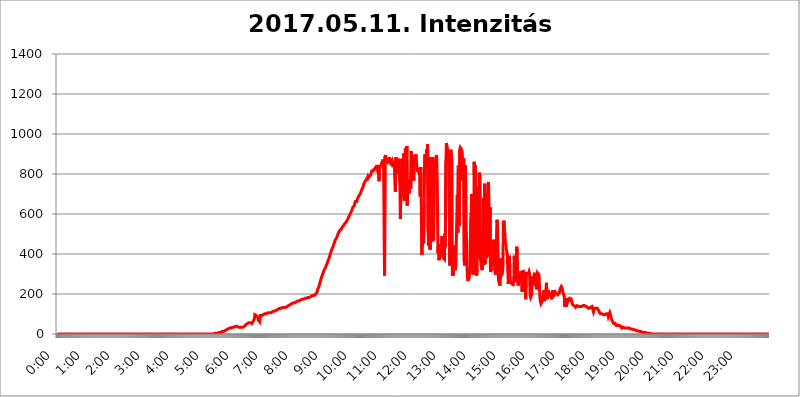
| Category | 2017.05.11. Intenzitás [W/m^2] |
|---|---|
| 0.0 | 0 |
| 0.0006944444444444445 | 0 |
| 0.001388888888888889 | 0 |
| 0.0020833333333333333 | 0 |
| 0.002777777777777778 | 0 |
| 0.003472222222222222 | 0 |
| 0.004166666666666667 | 0 |
| 0.004861111111111111 | 0 |
| 0.005555555555555556 | 0 |
| 0.0062499999999999995 | 0 |
| 0.006944444444444444 | 0 |
| 0.007638888888888889 | 0 |
| 0.008333333333333333 | 0 |
| 0.009027777777777779 | 0 |
| 0.009722222222222222 | 0 |
| 0.010416666666666666 | 0 |
| 0.011111111111111112 | 0 |
| 0.011805555555555555 | 0 |
| 0.012499999999999999 | 0 |
| 0.013194444444444444 | 0 |
| 0.013888888888888888 | 0 |
| 0.014583333333333332 | 0 |
| 0.015277777777777777 | 0 |
| 0.015972222222222224 | 0 |
| 0.016666666666666666 | 0 |
| 0.017361111111111112 | 0 |
| 0.018055555555555557 | 0 |
| 0.01875 | 0 |
| 0.019444444444444445 | 0 |
| 0.02013888888888889 | 0 |
| 0.020833333333333332 | 0 |
| 0.02152777777777778 | 0 |
| 0.022222222222222223 | 0 |
| 0.02291666666666667 | 0 |
| 0.02361111111111111 | 0 |
| 0.024305555555555556 | 0 |
| 0.024999999999999998 | 0 |
| 0.025694444444444447 | 0 |
| 0.02638888888888889 | 0 |
| 0.027083333333333334 | 0 |
| 0.027777777777777776 | 0 |
| 0.02847222222222222 | 0 |
| 0.029166666666666664 | 0 |
| 0.029861111111111113 | 0 |
| 0.030555555555555555 | 0 |
| 0.03125 | 0 |
| 0.03194444444444445 | 0 |
| 0.03263888888888889 | 0 |
| 0.03333333333333333 | 0 |
| 0.034027777777777775 | 0 |
| 0.034722222222222224 | 0 |
| 0.035416666666666666 | 0 |
| 0.036111111111111115 | 0 |
| 0.03680555555555556 | 0 |
| 0.0375 | 0 |
| 0.03819444444444444 | 0 |
| 0.03888888888888889 | 0 |
| 0.03958333333333333 | 0 |
| 0.04027777777777778 | 0 |
| 0.04097222222222222 | 0 |
| 0.041666666666666664 | 0 |
| 0.042361111111111106 | 0 |
| 0.04305555555555556 | 0 |
| 0.043750000000000004 | 0 |
| 0.044444444444444446 | 0 |
| 0.04513888888888889 | 0 |
| 0.04583333333333334 | 0 |
| 0.04652777777777778 | 0 |
| 0.04722222222222222 | 0 |
| 0.04791666666666666 | 0 |
| 0.04861111111111111 | 0 |
| 0.049305555555555554 | 0 |
| 0.049999999999999996 | 0 |
| 0.05069444444444445 | 0 |
| 0.051388888888888894 | 0 |
| 0.052083333333333336 | 0 |
| 0.05277777777777778 | 0 |
| 0.05347222222222222 | 0 |
| 0.05416666666666667 | 0 |
| 0.05486111111111111 | 0 |
| 0.05555555555555555 | 0 |
| 0.05625 | 0 |
| 0.05694444444444444 | 0 |
| 0.057638888888888885 | 0 |
| 0.05833333333333333 | 0 |
| 0.05902777777777778 | 0 |
| 0.059722222222222225 | 0 |
| 0.06041666666666667 | 0 |
| 0.061111111111111116 | 0 |
| 0.06180555555555556 | 0 |
| 0.0625 | 0 |
| 0.06319444444444444 | 0 |
| 0.06388888888888888 | 0 |
| 0.06458333333333334 | 0 |
| 0.06527777777777778 | 0 |
| 0.06597222222222222 | 0 |
| 0.06666666666666667 | 0 |
| 0.06736111111111111 | 0 |
| 0.06805555555555555 | 0 |
| 0.06874999999999999 | 0 |
| 0.06944444444444443 | 0 |
| 0.07013888888888889 | 0 |
| 0.07083333333333333 | 0 |
| 0.07152777777777779 | 0 |
| 0.07222222222222223 | 0 |
| 0.07291666666666667 | 0 |
| 0.07361111111111111 | 0 |
| 0.07430555555555556 | 0 |
| 0.075 | 0 |
| 0.07569444444444444 | 0 |
| 0.0763888888888889 | 0 |
| 0.07708333333333334 | 0 |
| 0.07777777777777778 | 0 |
| 0.07847222222222222 | 0 |
| 0.07916666666666666 | 0 |
| 0.0798611111111111 | 0 |
| 0.08055555555555556 | 0 |
| 0.08125 | 0 |
| 0.08194444444444444 | 0 |
| 0.08263888888888889 | 0 |
| 0.08333333333333333 | 0 |
| 0.08402777777777777 | 0 |
| 0.08472222222222221 | 0 |
| 0.08541666666666665 | 0 |
| 0.08611111111111112 | 0 |
| 0.08680555555555557 | 0 |
| 0.08750000000000001 | 0 |
| 0.08819444444444445 | 0 |
| 0.08888888888888889 | 0 |
| 0.08958333333333333 | 0 |
| 0.09027777777777778 | 0 |
| 0.09097222222222222 | 0 |
| 0.09166666666666667 | 0 |
| 0.09236111111111112 | 0 |
| 0.09305555555555556 | 0 |
| 0.09375 | 0 |
| 0.09444444444444444 | 0 |
| 0.09513888888888888 | 0 |
| 0.09583333333333333 | 0 |
| 0.09652777777777777 | 0 |
| 0.09722222222222222 | 0 |
| 0.09791666666666667 | 0 |
| 0.09861111111111111 | 0 |
| 0.09930555555555555 | 0 |
| 0.09999999999999999 | 0 |
| 0.10069444444444443 | 0 |
| 0.1013888888888889 | 0 |
| 0.10208333333333335 | 0 |
| 0.10277777777777779 | 0 |
| 0.10347222222222223 | 0 |
| 0.10416666666666667 | 0 |
| 0.10486111111111111 | 0 |
| 0.10555555555555556 | 0 |
| 0.10625 | 0 |
| 0.10694444444444444 | 0 |
| 0.1076388888888889 | 0 |
| 0.10833333333333334 | 0 |
| 0.10902777777777778 | 0 |
| 0.10972222222222222 | 0 |
| 0.1111111111111111 | 0 |
| 0.11180555555555556 | 0 |
| 0.11180555555555556 | 0 |
| 0.1125 | 0 |
| 0.11319444444444444 | 0 |
| 0.11388888888888889 | 0 |
| 0.11458333333333333 | 0 |
| 0.11527777777777777 | 0 |
| 0.11597222222222221 | 0 |
| 0.11666666666666665 | 0 |
| 0.1173611111111111 | 0 |
| 0.11805555555555557 | 0 |
| 0.11944444444444445 | 0 |
| 0.12013888888888889 | 0 |
| 0.12083333333333333 | 0 |
| 0.12152777777777778 | 0 |
| 0.12222222222222223 | 0 |
| 0.12291666666666667 | 0 |
| 0.12291666666666667 | 0 |
| 0.12361111111111112 | 0 |
| 0.12430555555555556 | 0 |
| 0.125 | 0 |
| 0.12569444444444444 | 0 |
| 0.12638888888888888 | 0 |
| 0.12708333333333333 | 0 |
| 0.16875 | 0 |
| 0.12847222222222224 | 0 |
| 0.12916666666666668 | 0 |
| 0.12986111111111112 | 0 |
| 0.13055555555555556 | 0 |
| 0.13125 | 0 |
| 0.13194444444444445 | 0 |
| 0.1326388888888889 | 0 |
| 0.13333333333333333 | 0 |
| 0.13402777777777777 | 0 |
| 0.13402777777777777 | 0 |
| 0.13472222222222222 | 0 |
| 0.13541666666666666 | 0 |
| 0.1361111111111111 | 0 |
| 0.13749999999999998 | 0 |
| 0.13819444444444443 | 0 |
| 0.1388888888888889 | 0 |
| 0.13958333333333334 | 0 |
| 0.14027777777777778 | 0 |
| 0.14097222222222222 | 0 |
| 0.14166666666666666 | 0 |
| 0.1423611111111111 | 0 |
| 0.14305555555555557 | 0 |
| 0.14375000000000002 | 0 |
| 0.14444444444444446 | 0 |
| 0.1451388888888889 | 0 |
| 0.1451388888888889 | 0 |
| 0.14652777777777778 | 0 |
| 0.14722222222222223 | 0 |
| 0.14791666666666667 | 0 |
| 0.1486111111111111 | 0 |
| 0.14930555555555555 | 0 |
| 0.15 | 0 |
| 0.15069444444444444 | 0 |
| 0.15138888888888888 | 0 |
| 0.15208333333333332 | 0 |
| 0.15277777777777776 | 0 |
| 0.15347222222222223 | 0 |
| 0.15416666666666667 | 0 |
| 0.15486111111111112 | 0 |
| 0.15555555555555556 | 0 |
| 0.15625 | 0 |
| 0.15694444444444444 | 0 |
| 0.15763888888888888 | 0 |
| 0.15833333333333333 | 0 |
| 0.15902777777777777 | 0 |
| 0.15972222222222224 | 0 |
| 0.16041666666666668 | 0 |
| 0.16111111111111112 | 0 |
| 0.16180555555555556 | 0 |
| 0.1625 | 0 |
| 0.16319444444444445 | 0 |
| 0.1638888888888889 | 0 |
| 0.16458333333333333 | 0 |
| 0.16527777777777777 | 0 |
| 0.16597222222222222 | 0 |
| 0.16666666666666666 | 0 |
| 0.1673611111111111 | 0 |
| 0.16805555555555554 | 0 |
| 0.16874999999999998 | 0 |
| 0.16944444444444443 | 0 |
| 0.17013888888888887 | 0 |
| 0.1708333333333333 | 0 |
| 0.17152777777777775 | 0 |
| 0.17222222222222225 | 0 |
| 0.1729166666666667 | 0 |
| 0.17361111111111113 | 0 |
| 0.17430555555555557 | 0 |
| 0.17500000000000002 | 0 |
| 0.17569444444444446 | 0 |
| 0.1763888888888889 | 0 |
| 0.17708333333333334 | 0 |
| 0.17777777777777778 | 0 |
| 0.17847222222222223 | 0 |
| 0.17916666666666667 | 0 |
| 0.1798611111111111 | 0 |
| 0.18055555555555555 | 0 |
| 0.18125 | 0 |
| 0.18194444444444444 | 0 |
| 0.1826388888888889 | 0 |
| 0.18333333333333335 | 0 |
| 0.1840277777777778 | 0 |
| 0.18472222222222223 | 0 |
| 0.18541666666666667 | 0 |
| 0.18611111111111112 | 0 |
| 0.18680555555555556 | 0 |
| 0.1875 | 0 |
| 0.18819444444444444 | 0 |
| 0.18888888888888888 | 0 |
| 0.18958333333333333 | 0 |
| 0.19027777777777777 | 0 |
| 0.1909722222222222 | 0 |
| 0.19166666666666665 | 0 |
| 0.19236111111111112 | 0 |
| 0.19305555555555554 | 0 |
| 0.19375 | 0 |
| 0.19444444444444445 | 0 |
| 0.1951388888888889 | 0 |
| 0.19583333333333333 | 0 |
| 0.19652777777777777 | 0 |
| 0.19722222222222222 | 0 |
| 0.19791666666666666 | 0 |
| 0.1986111111111111 | 0 |
| 0.19930555555555554 | 0 |
| 0.19999999999999998 | 0 |
| 0.20069444444444443 | 0 |
| 0.20138888888888887 | 0 |
| 0.2020833333333333 | 0 |
| 0.2027777777777778 | 0 |
| 0.2034722222222222 | 0 |
| 0.2041666666666667 | 0 |
| 0.20486111111111113 | 0 |
| 0.20555555555555557 | 0 |
| 0.20625000000000002 | 0 |
| 0.20694444444444446 | 0 |
| 0.2076388888888889 | 0 |
| 0.20833333333333334 | 0 |
| 0.20902777777777778 | 0 |
| 0.20972222222222223 | 0 |
| 0.21041666666666667 | 0 |
| 0.2111111111111111 | 0 |
| 0.21180555555555555 | 0 |
| 0.2125 | 0 |
| 0.21319444444444444 | 0 |
| 0.2138888888888889 | 0 |
| 0.21458333333333335 | 0 |
| 0.2152777777777778 | 0 |
| 0.21597222222222223 | 0 |
| 0.21666666666666667 | 0 |
| 0.21736111111111112 | 0 |
| 0.21805555555555556 | 0 |
| 0.21875 | 0 |
| 0.21944444444444444 | 0 |
| 0.22013888888888888 | 3.525 |
| 0.22083333333333333 | 3.525 |
| 0.22152777777777777 | 3.525 |
| 0.2222222222222222 | 3.525 |
| 0.22291666666666665 | 3.525 |
| 0.2236111111111111 | 3.525 |
| 0.22430555555555556 | 3.525 |
| 0.225 | 3.525 |
| 0.22569444444444445 | 3.525 |
| 0.2263888888888889 | 7.887 |
| 0.22708333333333333 | 7.887 |
| 0.22777777777777777 | 7.887 |
| 0.22847222222222222 | 7.887 |
| 0.22916666666666666 | 7.887 |
| 0.2298611111111111 | 7.887 |
| 0.23055555555555554 | 7.887 |
| 0.23124999999999998 | 12.257 |
| 0.23194444444444443 | 12.257 |
| 0.23263888888888887 | 12.257 |
| 0.2333333333333333 | 12.257 |
| 0.2340277777777778 | 16.636 |
| 0.2347222222222222 | 16.636 |
| 0.2354166666666667 | 16.636 |
| 0.23611111111111113 | 16.636 |
| 0.23680555555555557 | 21.024 |
| 0.23750000000000002 | 21.024 |
| 0.23819444444444446 | 21.024 |
| 0.2388888888888889 | 25.419 |
| 0.23958333333333334 | 25.419 |
| 0.24027777777777778 | 25.419 |
| 0.24097222222222223 | 29.823 |
| 0.24166666666666667 | 29.823 |
| 0.2423611111111111 | 29.823 |
| 0.24305555555555555 | 29.823 |
| 0.24375 | 29.823 |
| 0.24444444444444446 | 34.234 |
| 0.24513888888888888 | 34.234 |
| 0.24583333333333335 | 34.234 |
| 0.2465277777777778 | 34.234 |
| 0.24722222222222223 | 34.234 |
| 0.24791666666666667 | 34.234 |
| 0.24861111111111112 | 34.234 |
| 0.24930555555555556 | 34.234 |
| 0.25 | 38.653 |
| 0.25069444444444444 | 38.653 |
| 0.2513888888888889 | 38.653 |
| 0.2520833333333333 | 38.653 |
| 0.25277777777777777 | 38.653 |
| 0.2534722222222222 | 38.653 |
| 0.25416666666666665 | 34.234 |
| 0.2548611111111111 | 34.234 |
| 0.2555555555555556 | 34.234 |
| 0.25625000000000003 | 34.234 |
| 0.2569444444444445 | 34.234 |
| 0.2576388888888889 | 34.234 |
| 0.25833333333333336 | 34.234 |
| 0.2590277777777778 | 34.234 |
| 0.25972222222222224 | 34.234 |
| 0.2604166666666667 | 34.234 |
| 0.2611111111111111 | 38.653 |
| 0.26180555555555557 | 38.653 |
| 0.2625 | 38.653 |
| 0.26319444444444445 | 43.079 |
| 0.2638888888888889 | 43.079 |
| 0.26458333333333334 | 47.511 |
| 0.2652777777777778 | 47.511 |
| 0.2659722222222222 | 51.951 |
| 0.26666666666666666 | 51.951 |
| 0.2673611111111111 | 51.951 |
| 0.26805555555555555 | 56.398 |
| 0.26875 | 56.398 |
| 0.26944444444444443 | 56.398 |
| 0.2701388888888889 | 56.398 |
| 0.2708333333333333 | 56.398 |
| 0.27152777777777776 | 56.398 |
| 0.2722222222222222 | 51.951 |
| 0.27291666666666664 | 51.951 |
| 0.2736111111111111 | 56.398 |
| 0.2743055555555555 | 60.85 |
| 0.27499999999999997 | 60.85 |
| 0.27569444444444446 | 65.31 |
| 0.27638888888888885 | 74.246 |
| 0.27708333333333335 | 96.682 |
| 0.2777777777777778 | 96.682 |
| 0.27847222222222223 | 101.184 |
| 0.2791666666666667 | 92.184 |
| 0.2798611111111111 | 96.682 |
| 0.28055555555555556 | 92.184 |
| 0.28125 | 83.205 |
| 0.28194444444444444 | 69.775 |
| 0.2826388888888889 | 65.31 |
| 0.2833333333333333 | 65.31 |
| 0.28402777777777777 | 60.85 |
| 0.2847222222222222 | 92.184 |
| 0.28541666666666665 | 92.184 |
| 0.28611111111111115 | 92.184 |
| 0.28680555555555554 | 92.184 |
| 0.28750000000000003 | 96.682 |
| 0.2881944444444445 | 96.682 |
| 0.2888888888888889 | 96.682 |
| 0.28958333333333336 | 96.682 |
| 0.2902777777777778 | 96.682 |
| 0.29097222222222224 | 101.184 |
| 0.2916666666666667 | 101.184 |
| 0.2923611111111111 | 101.184 |
| 0.29305555555555557 | 101.184 |
| 0.29375 | 101.184 |
| 0.29444444444444445 | 101.184 |
| 0.2951388888888889 | 105.69 |
| 0.29583333333333334 | 105.69 |
| 0.2965277777777778 | 105.69 |
| 0.2972222222222222 | 105.69 |
| 0.29791666666666666 | 105.69 |
| 0.2986111111111111 | 105.69 |
| 0.29930555555555555 | 105.69 |
| 0.3 | 105.69 |
| 0.30069444444444443 | 110.201 |
| 0.3013888888888889 | 110.201 |
| 0.3020833333333333 | 110.201 |
| 0.30277777777777776 | 110.201 |
| 0.3034722222222222 | 114.716 |
| 0.30416666666666664 | 114.716 |
| 0.3048611111111111 | 114.716 |
| 0.3055555555555555 | 114.716 |
| 0.30624999999999997 | 119.235 |
| 0.3069444444444444 | 119.235 |
| 0.3076388888888889 | 119.235 |
| 0.30833333333333335 | 119.235 |
| 0.3090277777777778 | 119.235 |
| 0.30972222222222223 | 123.758 |
| 0.3104166666666667 | 123.758 |
| 0.3111111111111111 | 123.758 |
| 0.31180555555555556 | 128.284 |
| 0.3125 | 128.284 |
| 0.31319444444444444 | 128.284 |
| 0.3138888888888889 | 128.284 |
| 0.3145833333333333 | 128.284 |
| 0.31527777777777777 | 128.284 |
| 0.3159722222222222 | 132.814 |
| 0.31666666666666665 | 132.814 |
| 0.31736111111111115 | 132.814 |
| 0.31805555555555554 | 132.814 |
| 0.31875000000000003 | 132.814 |
| 0.3194444444444445 | 137.347 |
| 0.3201388888888889 | 132.814 |
| 0.32083333333333336 | 137.347 |
| 0.3215277777777778 | 137.347 |
| 0.32222222222222224 | 137.347 |
| 0.3229166666666667 | 141.884 |
| 0.3236111111111111 | 141.884 |
| 0.32430555555555557 | 141.884 |
| 0.325 | 146.423 |
| 0.32569444444444445 | 146.423 |
| 0.3263888888888889 | 146.423 |
| 0.32708333333333334 | 146.423 |
| 0.3277777777777778 | 146.423 |
| 0.3284722222222222 | 150.964 |
| 0.32916666666666666 | 150.964 |
| 0.3298611111111111 | 150.964 |
| 0.33055555555555555 | 155.509 |
| 0.33125 | 155.509 |
| 0.33194444444444443 | 155.509 |
| 0.3326388888888889 | 155.509 |
| 0.3333333333333333 | 155.509 |
| 0.3340277777777778 | 160.056 |
| 0.3347222222222222 | 160.056 |
| 0.3354166666666667 | 160.056 |
| 0.3361111111111111 | 160.056 |
| 0.3368055555555556 | 164.605 |
| 0.33749999999999997 | 164.605 |
| 0.33819444444444446 | 164.605 |
| 0.33888888888888885 | 164.605 |
| 0.33958333333333335 | 169.156 |
| 0.34027777777777773 | 169.156 |
| 0.34097222222222223 | 169.156 |
| 0.3416666666666666 | 169.156 |
| 0.3423611111111111 | 173.709 |
| 0.3430555555555555 | 173.709 |
| 0.34375 | 173.709 |
| 0.3444444444444445 | 173.709 |
| 0.3451388888888889 | 173.709 |
| 0.3458333333333334 | 173.709 |
| 0.34652777777777777 | 173.709 |
| 0.34722222222222227 | 178.264 |
| 0.34791666666666665 | 178.264 |
| 0.34861111111111115 | 178.264 |
| 0.34930555555555554 | 178.264 |
| 0.35000000000000003 | 178.264 |
| 0.3506944444444444 | 182.82 |
| 0.3513888888888889 | 182.82 |
| 0.3520833333333333 | 182.82 |
| 0.3527777777777778 | 182.82 |
| 0.3534722222222222 | 182.82 |
| 0.3541666666666667 | 187.378 |
| 0.3548611111111111 | 187.378 |
| 0.35555555555555557 | 187.378 |
| 0.35625 | 187.378 |
| 0.35694444444444445 | 187.378 |
| 0.3576388888888889 | 191.937 |
| 0.35833333333333334 | 191.937 |
| 0.3590277777777778 | 191.937 |
| 0.3597222222222222 | 191.937 |
| 0.36041666666666666 | 191.937 |
| 0.3611111111111111 | 196.497 |
| 0.36180555555555555 | 196.497 |
| 0.3625 | 201.058 |
| 0.36319444444444443 | 201.058 |
| 0.3638888888888889 | 205.62 |
| 0.3645833333333333 | 214.746 |
| 0.3652777777777778 | 223.873 |
| 0.3659722222222222 | 228.436 |
| 0.3666666666666667 | 233 |
| 0.3673611111111111 | 242.127 |
| 0.3680555555555556 | 251.251 |
| 0.36874999999999997 | 260.373 |
| 0.36944444444444446 | 269.49 |
| 0.37013888888888885 | 278.603 |
| 0.37083333333333335 | 283.156 |
| 0.37152777777777773 | 292.259 |
| 0.37222222222222223 | 296.808 |
| 0.3729166666666666 | 305.898 |
| 0.3736111111111111 | 310.44 |
| 0.3743055555555555 | 319.517 |
| 0.375 | 324.052 |
| 0.3756944444444445 | 324.052 |
| 0.3763888888888889 | 333.113 |
| 0.3770833333333334 | 342.162 |
| 0.37777777777777777 | 346.682 |
| 0.37847222222222227 | 351.198 |
| 0.37916666666666665 | 360.221 |
| 0.37986111111111115 | 364.728 |
| 0.38055555555555554 | 373.729 |
| 0.38125000000000003 | 378.224 |
| 0.3819444444444444 | 387.202 |
| 0.3826388888888889 | 396.164 |
| 0.3833333333333333 | 405.108 |
| 0.3840277777777778 | 409.574 |
| 0.3847222222222222 | 418.492 |
| 0.3854166666666667 | 422.943 |
| 0.3861111111111111 | 431.833 |
| 0.38680555555555557 | 436.27 |
| 0.3875 | 445.129 |
| 0.38819444444444445 | 445.129 |
| 0.3888888888888889 | 458.38 |
| 0.38958333333333334 | 467.187 |
| 0.3902777777777778 | 471.582 |
| 0.3909722222222222 | 475.972 |
| 0.39166666666666666 | 480.356 |
| 0.3923611111111111 | 484.735 |
| 0.39305555555555555 | 493.475 |
| 0.39375 | 497.836 |
| 0.39444444444444443 | 506.542 |
| 0.3951388888888889 | 506.542 |
| 0.3958333333333333 | 506.542 |
| 0.3965277777777778 | 519.555 |
| 0.3972222222222222 | 523.88 |
| 0.3979166666666667 | 523.88 |
| 0.3986111111111111 | 523.88 |
| 0.3993055555555556 | 532.513 |
| 0.39999999999999997 | 536.82 |
| 0.40069444444444446 | 536.82 |
| 0.40138888888888885 | 541.121 |
| 0.40208333333333335 | 541.121 |
| 0.40277777777777773 | 549.704 |
| 0.40347222222222223 | 549.704 |
| 0.4041666666666666 | 549.704 |
| 0.4048611111111111 | 558.261 |
| 0.4055555555555555 | 558.261 |
| 0.40625 | 566.793 |
| 0.4069444444444445 | 566.793 |
| 0.4076388888888889 | 575.299 |
| 0.4083333333333334 | 579.542 |
| 0.40902777777777777 | 588.009 |
| 0.40972222222222227 | 592.233 |
| 0.41041666666666665 | 596.45 |
| 0.41111111111111115 | 600.661 |
| 0.41180555555555554 | 609.062 |
| 0.41250000000000003 | 613.252 |
| 0.4131944444444444 | 617.436 |
| 0.4138888888888889 | 625.784 |
| 0.4145833333333333 | 634.105 |
| 0.4152777777777778 | 638.256 |
| 0.4159722222222222 | 638.256 |
| 0.4166666666666667 | 642.4 |
| 0.4173611111111111 | 654.791 |
| 0.41805555555555557 | 663.019 |
| 0.41875 | 658.909 |
| 0.41944444444444445 | 663.019 |
| 0.4201388888888889 | 663.019 |
| 0.42083333333333334 | 675.311 |
| 0.4215277777777778 | 679.395 |
| 0.4222222222222222 | 683.473 |
| 0.42291666666666666 | 691.608 |
| 0.4236111111111111 | 691.608 |
| 0.42430555555555555 | 691.608 |
| 0.425 | 699.717 |
| 0.42569444444444443 | 707.8 |
| 0.4263888888888889 | 715.858 |
| 0.4270833333333333 | 719.877 |
| 0.4277777777777778 | 719.877 |
| 0.4284722222222222 | 731.896 |
| 0.4291666666666667 | 739.877 |
| 0.4298611111111111 | 747.834 |
| 0.4305555555555556 | 755.766 |
| 0.43124999999999997 | 755.766 |
| 0.43194444444444446 | 763.674 |
| 0.43263888888888885 | 759.723 |
| 0.43333333333333335 | 763.674 |
| 0.43402777777777773 | 775.492 |
| 0.43472222222222223 | 779.42 |
| 0.4354166666666666 | 787.258 |
| 0.4361111111111111 | 779.42 |
| 0.4368055555555555 | 779.42 |
| 0.4375 | 787.258 |
| 0.4381944444444445 | 787.258 |
| 0.4388888888888889 | 791.169 |
| 0.4395833333333334 | 795.074 |
| 0.44027777777777777 | 806.757 |
| 0.44097222222222227 | 814.519 |
| 0.44166666666666665 | 814.519 |
| 0.44236111111111115 | 814.519 |
| 0.44305555555555554 | 814.519 |
| 0.44375000000000003 | 822.26 |
| 0.4444444444444444 | 826.123 |
| 0.4451388888888889 | 822.26 |
| 0.4458333333333333 | 826.123 |
| 0.4465277777777778 | 837.682 |
| 0.4472222222222222 | 829.981 |
| 0.4479166666666667 | 826.123 |
| 0.4486111111111111 | 845.365 |
| 0.44930555555555557 | 845.365 |
| 0.45 | 849.199 |
| 0.45069444444444445 | 798.974 |
| 0.4513888888888889 | 763.674 |
| 0.45208333333333334 | 841.526 |
| 0.4527777777777778 | 833.834 |
| 0.4534722222222222 | 833.834 |
| 0.45416666666666666 | 837.682 |
| 0.4548611111111111 | 853.029 |
| 0.45555555555555555 | 845.365 |
| 0.45625 | 860.676 |
| 0.45694444444444443 | 872.114 |
| 0.4576388888888889 | 845.365 |
| 0.4583333333333333 | 845.365 |
| 0.4590277777777778 | 292.259 |
| 0.4597222222222222 | 887.309 |
| 0.4604166666666667 | 894.885 |
| 0.4611111111111111 | 875.918 |
| 0.4618055555555556 | 875.918 |
| 0.46249999999999997 | 875.918 |
| 0.46319444444444446 | 868.305 |
| 0.46388888888888885 | 860.676 |
| 0.46458333333333335 | 864.493 |
| 0.46527777777777773 | 868.305 |
| 0.46597222222222223 | 883.516 |
| 0.4666666666666666 | 868.305 |
| 0.4673611111111111 | 856.855 |
| 0.4680555555555555 | 860.676 |
| 0.46875 | 860.676 |
| 0.4694444444444445 | 868.305 |
| 0.4701388888888889 | 868.305 |
| 0.4708333333333334 | 833.834 |
| 0.47152777777777777 | 845.365 |
| 0.47222222222222227 | 841.526 |
| 0.47291666666666665 | 864.493 |
| 0.47361111111111115 | 868.305 |
| 0.47430555555555554 | 711.832 |
| 0.47500000000000003 | 883.516 |
| 0.4756944444444444 | 860.676 |
| 0.4763888888888889 | 829.981 |
| 0.4770833333333333 | 845.365 |
| 0.4777777777777778 | 810.641 |
| 0.4784722222222222 | 875.918 |
| 0.4791666666666667 | 798.974 |
| 0.4798611111111111 | 826.123 |
| 0.48055555555555557 | 755.766 |
| 0.48125 | 575.299 |
| 0.48194444444444445 | 719.877 |
| 0.4826388888888889 | 814.519 |
| 0.48333333333333334 | 875.918 |
| 0.4840277777777778 | 687.544 |
| 0.4847222222222222 | 826.123 |
| 0.48541666666666666 | 775.492 |
| 0.4861111111111111 | 902.447 |
| 0.48680555555555555 | 667.123 |
| 0.4875 | 755.766 |
| 0.48819444444444443 | 928.819 |
| 0.4888888888888889 | 932.576 |
| 0.4895833333333333 | 879.719 |
| 0.4902777777777778 | 940.082 |
| 0.4909722222222222 | 642.4 |
| 0.4916666666666667 | 739.877 |
| 0.4923611111111111 | 703.762 |
| 0.4930555555555556 | 739.877 |
| 0.49374999999999997 | 703.762 |
| 0.49444444444444446 | 771.559 |
| 0.49513888888888885 | 767.62 |
| 0.49583333333333335 | 727.896 |
| 0.49652777777777773 | 913.766 |
| 0.49722222222222223 | 887.309 |
| 0.4979166666666666 | 853.029 |
| 0.4986111111111111 | 798.974 |
| 0.4993055555555555 | 837.682 |
| 0.5 | 767.62 |
| 0.5006944444444444 | 887.309 |
| 0.5013888888888889 | 894.885 |
| 0.5020833333333333 | 868.305 |
| 0.5027777777777778 | 898.668 |
| 0.5034722222222222 | 875.918 |
| 0.5041666666666667 | 845.365 |
| 0.5048611111111111 | 822.26 |
| 0.5055555555555555 | 810.641 |
| 0.50625 | 829.981 |
| 0.5069444444444444 | 810.641 |
| 0.5076388888888889 | 802.868 |
| 0.5083333333333333 | 791.169 |
| 0.5090277777777777 | 687.544 |
| 0.5097222222222222 | 833.834 |
| 0.5104166666666666 | 759.723 |
| 0.5111111111111112 | 396.164 |
| 0.5118055555555555 | 405.108 |
| 0.5125000000000001 | 480.356 |
| 0.5131944444444444 | 510.885 |
| 0.513888888888889 | 453.968 |
| 0.5145833333333333 | 650.667 |
| 0.5152777777777778 | 883.516 |
| 0.5159722222222222 | 898.668 |
| 0.5166666666666667 | 902.447 |
| 0.517361111111111 | 837.682 |
| 0.5180555555555556 | 925.06 |
| 0.5187499999999999 | 902.447 |
| 0.5194444444444445 | 947.58 |
| 0.5201388888888888 | 515.223 |
| 0.5208333333333334 | 440.702 |
| 0.5215277777777778 | 493.475 |
| 0.5222222222222223 | 883.516 |
| 0.5229166666666667 | 422.943 |
| 0.5236111111111111 | 806.757 |
| 0.5243055555555556 | 829.981 |
| 0.525 | 600.661 |
| 0.5256944444444445 | 462.786 |
| 0.5263888888888889 | 883.516 |
| 0.5270833333333333 | 872.114 |
| 0.5277777777777778 | 467.187 |
| 0.5284722222222222 | 841.526 |
| 0.5291666666666667 | 791.169 |
| 0.5298611111111111 | 837.682 |
| 0.5305555555555556 | 860.676 |
| 0.53125 | 887.309 |
| 0.5319444444444444 | 894.885 |
| 0.5326388888888889 | 891.099 |
| 0.5333333333333333 | 604.864 |
| 0.5340277777777778 | 405.108 |
| 0.5347222222222222 | 449.551 |
| 0.5354166666666667 | 369.23 |
| 0.5361111111111111 | 373.729 |
| 0.5368055555555555 | 396.164 |
| 0.5375 | 400.638 |
| 0.5381944444444444 | 405.108 |
| 0.5388888888888889 | 396.164 |
| 0.5395833333333333 | 489.108 |
| 0.5402777777777777 | 458.38 |
| 0.5409722222222222 | 382.715 |
| 0.5416666666666666 | 378.224 |
| 0.5423611111111112 | 387.202 |
| 0.5430555555555555 | 373.729 |
| 0.5437500000000001 | 502.192 |
| 0.5444444444444444 | 436.27 |
| 0.545138888888889 | 864.493 |
| 0.5458333333333333 | 955.071 |
| 0.5465277777777778 | 936.33 |
| 0.5472222222222222 | 928.819 |
| 0.5479166666666667 | 921.298 |
| 0.548611111111111 | 856.855 |
| 0.5493055555555556 | 909.996 |
| 0.5499999999999999 | 906.223 |
| 0.5506944444444445 | 342.162 |
| 0.5513888888888888 | 711.832 |
| 0.5520833333333334 | 921.298 |
| 0.5527777777777778 | 887.309 |
| 0.5534722222222223 | 875.918 |
| 0.5541666666666667 | 292.259 |
| 0.5548611111111111 | 310.44 |
| 0.5555555555555556 | 292.259 |
| 0.55625 | 337.639 |
| 0.5569444444444445 | 445.129 |
| 0.5576388888888889 | 333.113 |
| 0.5583333333333333 | 319.517 |
| 0.5590277777777778 | 351.198 |
| 0.5597222222222222 | 355.712 |
| 0.5604166666666667 | 346.682 |
| 0.5611111111111111 | 695.666 |
| 0.5618055555555556 | 506.542 |
| 0.5625 | 841.526 |
| 0.5631944444444444 | 818.392 |
| 0.5638888888888889 | 541.121 |
| 0.5645833333333333 | 921.298 |
| 0.5652777777777778 | 932.576 |
| 0.5659722222222222 | 932.576 |
| 0.5666666666666667 | 925.06 |
| 0.5673611111111111 | 917.534 |
| 0.5680555555555555 | 909.996 |
| 0.56875 | 767.62 |
| 0.5694444444444444 | 872.114 |
| 0.5701388888888889 | 879.719 |
| 0.5708333333333333 | 364.728 |
| 0.5715277777777777 | 342.162 |
| 0.5722222222222222 | 845.365 |
| 0.5729166666666666 | 735.89 |
| 0.5736111111111112 | 506.542 |
| 0.5743055555555555 | 462.786 |
| 0.5750000000000001 | 310.44 |
| 0.5756944444444444 | 264.932 |
| 0.576388888888889 | 264.932 |
| 0.5770833333333333 | 269.49 |
| 0.5777777777777778 | 283.156 |
| 0.5784722222222222 | 314.98 |
| 0.5791666666666667 | 337.639 |
| 0.579861111111111 | 571.049 |
| 0.5805555555555556 | 609.062 |
| 0.5812499999999999 | 699.717 |
| 0.5819444444444445 | 396.164 |
| 0.5826388888888888 | 305.898 |
| 0.5833333333333334 | 296.808 |
| 0.5840277777777778 | 314.98 |
| 0.5847222222222223 | 860.676 |
| 0.5854166666666667 | 715.858 |
| 0.5861111111111111 | 845.365 |
| 0.5868055555555556 | 414.035 |
| 0.5875 | 301.354 |
| 0.5881944444444445 | 292.259 |
| 0.5888888888888889 | 324.052 |
| 0.5895833333333333 | 735.89 |
| 0.5902777777777778 | 378.224 |
| 0.5909722222222222 | 458.38 |
| 0.5916666666666667 | 806.757 |
| 0.5923611111111111 | 810.641 |
| 0.5930555555555556 | 787.258 |
| 0.59375 | 369.23 |
| 0.5944444444444444 | 342.162 |
| 0.5951388888888889 | 342.162 |
| 0.5958333333333333 | 319.517 |
| 0.5965277777777778 | 342.162 |
| 0.5972222222222222 | 373.729 |
| 0.5979166666666667 | 679.395 |
| 0.5986111111111111 | 346.682 |
| 0.5993055555555555 | 751.803 |
| 0.6 | 351.198 |
| 0.6006944444444444 | 703.762 |
| 0.6013888888888889 | 378.224 |
| 0.6020833333333333 | 396.164 |
| 0.6027777777777777 | 493.475 |
| 0.6034722222222222 | 387.202 |
| 0.6041666666666666 | 751.803 |
| 0.6048611111111112 | 759.723 |
| 0.6055555555555555 | 558.261 |
| 0.6062500000000001 | 497.836 |
| 0.6069444444444444 | 634.105 |
| 0.607638888888889 | 310.44 |
| 0.6083333333333333 | 305.898 |
| 0.6090277777777778 | 324.052 |
| 0.6097222222222222 | 342.162 |
| 0.6104166666666667 | 351.198 |
| 0.611111111111111 | 387.202 |
| 0.6118055555555556 | 471.582 |
| 0.6124999999999999 | 369.23 |
| 0.6131944444444445 | 355.712 |
| 0.6138888888888888 | 310.44 |
| 0.6145833333333334 | 296.808 |
| 0.6152777777777778 | 301.354 |
| 0.6159722222222223 | 467.187 |
| 0.6166666666666667 | 571.049 |
| 0.6173611111111111 | 553.986 |
| 0.6180555555555556 | 440.702 |
| 0.61875 | 274.047 |
| 0.6194444444444445 | 260.373 |
| 0.6201388888888889 | 251.251 |
| 0.6208333333333333 | 242.127 |
| 0.6215277777777778 | 246.689 |
| 0.6222222222222222 | 378.224 |
| 0.6229166666666667 | 292.259 |
| 0.6236111111111111 | 287.709 |
| 0.6243055555555556 | 301.354 |
| 0.625 | 333.113 |
| 0.6256944444444444 | 553.986 |
| 0.6263888888888889 | 566.793 |
| 0.6270833333333333 | 523.88 |
| 0.6277777777777778 | 502.192 |
| 0.6284722222222222 | 458.38 |
| 0.6291666666666667 | 445.129 |
| 0.6298611111111111 | 422.943 |
| 0.6305555555555555 | 422.943 |
| 0.63125 | 396.164 |
| 0.6319444444444444 | 314.98 |
| 0.6326388888888889 | 251.251 |
| 0.6333333333333333 | 255.813 |
| 0.6340277777777777 | 391.685 |
| 0.6347222222222222 | 328.584 |
| 0.6354166666666666 | 269.49 |
| 0.6361111111111112 | 260.373 |
| 0.6368055555555555 | 264.932 |
| 0.6375000000000001 | 251.251 |
| 0.6381944444444444 | 246.689 |
| 0.638888888888889 | 246.689 |
| 0.6395833333333333 | 246.689 |
| 0.6402777777777778 | 255.813 |
| 0.6409722222222222 | 391.685 |
| 0.6416666666666667 | 314.98 |
| 0.642361111111111 | 278.603 |
| 0.6430555555555556 | 269.49 |
| 0.6437499999999999 | 260.373 |
| 0.6444444444444445 | 436.27 |
| 0.6451388888888888 | 409.574 |
| 0.6458333333333334 | 255.813 |
| 0.6465277777777778 | 242.127 |
| 0.6472222222222223 | 246.689 |
| 0.6479166666666667 | 296.808 |
| 0.6486111111111111 | 314.98 |
| 0.6493055555555556 | 301.354 |
| 0.65 | 269.49 |
| 0.6506944444444445 | 314.98 |
| 0.6513888888888889 | 251.251 |
| 0.6520833333333333 | 210.182 |
| 0.6527777777777778 | 283.156 |
| 0.6534722222222222 | 319.517 |
| 0.6541666666666667 | 310.44 |
| 0.6548611111111111 | 305.898 |
| 0.6555555555555556 | 305.898 |
| 0.65625 | 255.813 |
| 0.6569444444444444 | 173.709 |
| 0.6576388888888889 | 292.259 |
| 0.6583333333333333 | 310.44 |
| 0.6590277777777778 | 301.354 |
| 0.6597222222222222 | 296.808 |
| 0.6604166666666667 | 296.808 |
| 0.6611111111111111 | 301.354 |
| 0.6618055555555555 | 310.44 |
| 0.6625 | 301.354 |
| 0.6631944444444444 | 191.937 |
| 0.6638888888888889 | 182.82 |
| 0.6645833333333333 | 182.82 |
| 0.6652777777777777 | 196.497 |
| 0.6659722222222222 | 233 |
| 0.6666666666666666 | 287.709 |
| 0.6673611111111111 | 246.689 |
| 0.6680555555555556 | 242.127 |
| 0.6687500000000001 | 246.689 |
| 0.6694444444444444 | 305.898 |
| 0.6701388888888888 | 260.373 |
| 0.6708333333333334 | 251.251 |
| 0.6715277777777778 | 260.373 |
| 0.6722222222222222 | 223.873 |
| 0.6729166666666666 | 274.047 |
| 0.6736111111111112 | 305.898 |
| 0.6743055555555556 | 310.44 |
| 0.6749999999999999 | 310.44 |
| 0.6756944444444444 | 296.808 |
| 0.6763888888888889 | 228.436 |
| 0.6770833333333334 | 173.709 |
| 0.6777777777777777 | 160.056 |
| 0.6784722222222223 | 150.964 |
| 0.6791666666666667 | 155.509 |
| 0.6798611111111111 | 160.056 |
| 0.6805555555555555 | 169.156 |
| 0.68125 | 169.156 |
| 0.6819444444444445 | 164.605 |
| 0.6826388888888889 | 219.309 |
| 0.6833333333333332 | 164.605 |
| 0.6840277777777778 | 173.709 |
| 0.6847222222222222 | 182.82 |
| 0.6854166666666667 | 187.378 |
| 0.686111111111111 | 255.813 |
| 0.6868055555555556 | 191.937 |
| 0.6875 | 173.709 |
| 0.6881944444444444 | 219.309 |
| 0.688888888888889 | 205.62 |
| 0.6895833333333333 | 201.058 |
| 0.6902777777777778 | 201.058 |
| 0.6909722222222222 | 201.058 |
| 0.6916666666666668 | 191.937 |
| 0.6923611111111111 | 191.937 |
| 0.6930555555555555 | 196.497 |
| 0.69375 | 173.709 |
| 0.6944444444444445 | 210.182 |
| 0.6951388888888889 | 219.309 |
| 0.6958333333333333 | 219.309 |
| 0.6965277777777777 | 187.378 |
| 0.6972222222222223 | 219.309 |
| 0.6979166666666666 | 210.182 |
| 0.6986111111111111 | 210.182 |
| 0.6993055555555556 | 210.182 |
| 0.7000000000000001 | 205.62 |
| 0.7006944444444444 | 205.62 |
| 0.7013888888888888 | 201.058 |
| 0.7020833333333334 | 196.497 |
| 0.7027777777777778 | 196.497 |
| 0.7034722222222222 | 201.058 |
| 0.7041666666666666 | 205.62 |
| 0.7048611111111112 | 219.309 |
| 0.7055555555555556 | 228.436 |
| 0.7062499999999999 | 233 |
| 0.7069444444444444 | 237.564 |
| 0.7076388888888889 | 237.564 |
| 0.7083333333333334 | 228.436 |
| 0.7090277777777777 | 210.182 |
| 0.7097222222222223 | 205.62 |
| 0.7104166666666667 | 196.497 |
| 0.7111111111111111 | 187.378 |
| 0.7118055555555555 | 137.347 |
| 0.7125 | 169.156 |
| 0.7131944444444445 | 178.264 |
| 0.7138888888888889 | 137.347 |
| 0.7145833333333332 | 132.814 |
| 0.7152777777777778 | 160.056 |
| 0.7159722222222222 | 173.709 |
| 0.7166666666666667 | 173.709 |
| 0.717361111111111 | 178.264 |
| 0.7180555555555556 | 178.264 |
| 0.71875 | 169.156 |
| 0.7194444444444444 | 169.156 |
| 0.720138888888889 | 169.156 |
| 0.7208333333333333 | 173.709 |
| 0.7215277777777778 | 164.605 |
| 0.7222222222222222 | 155.509 |
| 0.7229166666666668 | 146.423 |
| 0.7236111111111111 | 146.423 |
| 0.7243055555555555 | 146.423 |
| 0.725 | 141.884 |
| 0.7256944444444445 | 141.884 |
| 0.7263888888888889 | 137.347 |
| 0.7270833333333333 | 132.814 |
| 0.7277777777777777 | 132.814 |
| 0.7284722222222223 | 137.347 |
| 0.7291666666666666 | 141.884 |
| 0.7298611111111111 | 141.884 |
| 0.7305555555555556 | 141.884 |
| 0.7312500000000001 | 137.347 |
| 0.7319444444444444 | 137.347 |
| 0.7326388888888888 | 137.347 |
| 0.7333333333333334 | 137.347 |
| 0.7340277777777778 | 137.347 |
| 0.7347222222222222 | 137.347 |
| 0.7354166666666666 | 137.347 |
| 0.7361111111111112 | 137.347 |
| 0.7368055555555556 | 137.347 |
| 0.7374999999999999 | 141.884 |
| 0.7381944444444444 | 141.884 |
| 0.7388888888888889 | 141.884 |
| 0.7395833333333334 | 141.884 |
| 0.7402777777777777 | 137.347 |
| 0.7409722222222223 | 137.347 |
| 0.7416666666666667 | 137.347 |
| 0.7423611111111111 | 137.347 |
| 0.7430555555555555 | 137.347 |
| 0.74375 | 132.814 |
| 0.7444444444444445 | 128.284 |
| 0.7451388888888889 | 128.284 |
| 0.7458333333333332 | 128.284 |
| 0.7465277777777778 | 128.284 |
| 0.7472222222222222 | 132.814 |
| 0.7479166666666667 | 132.814 |
| 0.748611111111111 | 132.814 |
| 0.7493055555555556 | 132.814 |
| 0.75 | 137.347 |
| 0.7506944444444444 | 137.347 |
| 0.751388888888889 | 137.347 |
| 0.7520833333333333 | 110.201 |
| 0.7527777777777778 | 114.716 |
| 0.7534722222222222 | 128.284 |
| 0.7541666666666668 | 128.284 |
| 0.7548611111111111 | 123.758 |
| 0.7555555555555555 | 128.284 |
| 0.75625 | 128.284 |
| 0.7569444444444445 | 128.284 |
| 0.7576388888888889 | 128.284 |
| 0.7583333333333333 | 123.758 |
| 0.7590277777777777 | 119.235 |
| 0.7597222222222223 | 114.716 |
| 0.7604166666666666 | 110.201 |
| 0.7611111111111111 | 105.69 |
| 0.7618055555555556 | 101.184 |
| 0.7625000000000001 | 101.184 |
| 0.7631944444444444 | 101.184 |
| 0.7638888888888888 | 101.184 |
| 0.7645833333333334 | 96.682 |
| 0.7652777777777778 | 96.682 |
| 0.7659722222222222 | 96.682 |
| 0.7666666666666666 | 96.682 |
| 0.7673611111111112 | 96.682 |
| 0.7680555555555556 | 96.682 |
| 0.7687499999999999 | 96.682 |
| 0.7694444444444444 | 96.682 |
| 0.7701388888888889 | 101.184 |
| 0.7708333333333334 | 101.184 |
| 0.7715277777777777 | 101.184 |
| 0.7722222222222223 | 101.184 |
| 0.7729166666666667 | 87.692 |
| 0.7736111111111111 | 87.692 |
| 0.7743055555555555 | 101.184 |
| 0.775 | 87.692 |
| 0.7756944444444445 | 96.682 |
| 0.7763888888888889 | 87.692 |
| 0.7770833333333332 | 78.722 |
| 0.7777777777777778 | 69.775 |
| 0.7784722222222222 | 65.31 |
| 0.7791666666666667 | 60.85 |
| 0.779861111111111 | 56.398 |
| 0.7805555555555556 | 51.951 |
| 0.78125 | 47.511 |
| 0.7819444444444444 | 51.951 |
| 0.782638888888889 | 51.951 |
| 0.7833333333333333 | 47.511 |
| 0.7840277777777778 | 43.079 |
| 0.7847222222222222 | 43.079 |
| 0.7854166666666668 | 43.079 |
| 0.7861111111111111 | 43.079 |
| 0.7868055555555555 | 43.079 |
| 0.7875 | 43.079 |
| 0.7881944444444445 | 43.079 |
| 0.7888888888888889 | 43.079 |
| 0.7895833333333333 | 38.653 |
| 0.7902777777777777 | 38.653 |
| 0.7909722222222223 | 34.234 |
| 0.7916666666666666 | 29.823 |
| 0.7923611111111111 | 29.823 |
| 0.7930555555555556 | 29.823 |
| 0.7937500000000001 | 34.234 |
| 0.7944444444444444 | 29.823 |
| 0.7951388888888888 | 29.823 |
| 0.7958333333333334 | 29.823 |
| 0.7965277777777778 | 29.823 |
| 0.7972222222222222 | 29.823 |
| 0.7979166666666666 | 29.823 |
| 0.7986111111111112 | 29.823 |
| 0.7993055555555556 | 25.419 |
| 0.7999999999999999 | 29.823 |
| 0.8006944444444444 | 29.823 |
| 0.8013888888888889 | 29.823 |
| 0.8020833333333334 | 29.823 |
| 0.8027777777777777 | 25.419 |
| 0.8034722222222223 | 25.419 |
| 0.8041666666666667 | 25.419 |
| 0.8048611111111111 | 25.419 |
| 0.8055555555555555 | 25.419 |
| 0.80625 | 25.419 |
| 0.8069444444444445 | 21.024 |
| 0.8076388888888889 | 21.024 |
| 0.8083333333333332 | 21.024 |
| 0.8090277777777778 | 21.024 |
| 0.8097222222222222 | 21.024 |
| 0.8104166666666667 | 21.024 |
| 0.811111111111111 | 21.024 |
| 0.8118055555555556 | 16.636 |
| 0.8125 | 16.636 |
| 0.8131944444444444 | 16.636 |
| 0.813888888888889 | 16.636 |
| 0.8145833333333333 | 16.636 |
| 0.8152777777777778 | 16.636 |
| 0.8159722222222222 | 16.636 |
| 0.8166666666666668 | 12.257 |
| 0.8173611111111111 | 12.257 |
| 0.8180555555555555 | 12.257 |
| 0.81875 | 12.257 |
| 0.8194444444444445 | 12.257 |
| 0.8201388888888889 | 12.257 |
| 0.8208333333333333 | 7.887 |
| 0.8215277777777777 | 7.887 |
| 0.8222222222222223 | 7.887 |
| 0.8229166666666666 | 7.887 |
| 0.8236111111111111 | 7.887 |
| 0.8243055555555556 | 7.887 |
| 0.8250000000000001 | 7.887 |
| 0.8256944444444444 | 7.887 |
| 0.8263888888888888 | 3.525 |
| 0.8270833333333334 | 3.525 |
| 0.8277777777777778 | 3.525 |
| 0.8284722222222222 | 3.525 |
| 0.8291666666666666 | 3.525 |
| 0.8298611111111112 | 3.525 |
| 0.8305555555555556 | 3.525 |
| 0.8312499999999999 | 3.525 |
| 0.8319444444444444 | 0 |
| 0.8326388888888889 | 0 |
| 0.8333333333333334 | 0 |
| 0.8340277777777777 | 0 |
| 0.8347222222222223 | 0 |
| 0.8354166666666667 | 0 |
| 0.8361111111111111 | 0 |
| 0.8368055555555555 | 0 |
| 0.8375 | 0 |
| 0.8381944444444445 | 0 |
| 0.8388888888888889 | 0 |
| 0.8395833333333332 | 0 |
| 0.8402777777777778 | 0 |
| 0.8409722222222222 | 0 |
| 0.8416666666666667 | 0 |
| 0.842361111111111 | 0 |
| 0.8430555555555556 | 0 |
| 0.84375 | 0 |
| 0.8444444444444444 | 0 |
| 0.845138888888889 | 0 |
| 0.8458333333333333 | 0 |
| 0.8465277777777778 | 0 |
| 0.8472222222222222 | 0 |
| 0.8479166666666668 | 0 |
| 0.8486111111111111 | 0 |
| 0.8493055555555555 | 0 |
| 0.85 | 0 |
| 0.8506944444444445 | 0 |
| 0.8513888888888889 | 0 |
| 0.8520833333333333 | 0 |
| 0.8527777777777777 | 0 |
| 0.8534722222222223 | 0 |
| 0.8541666666666666 | 0 |
| 0.8548611111111111 | 0 |
| 0.8555555555555556 | 0 |
| 0.8562500000000001 | 0 |
| 0.8569444444444444 | 0 |
| 0.8576388888888888 | 0 |
| 0.8583333333333334 | 0 |
| 0.8590277777777778 | 0 |
| 0.8597222222222222 | 0 |
| 0.8604166666666666 | 0 |
| 0.8611111111111112 | 0 |
| 0.8618055555555556 | 0 |
| 0.8624999999999999 | 0 |
| 0.8631944444444444 | 0 |
| 0.8638888888888889 | 0 |
| 0.8645833333333334 | 0 |
| 0.8652777777777777 | 0 |
| 0.8659722222222223 | 0 |
| 0.8666666666666667 | 0 |
| 0.8673611111111111 | 0 |
| 0.8680555555555555 | 0 |
| 0.86875 | 0 |
| 0.8694444444444445 | 0 |
| 0.8701388888888889 | 0 |
| 0.8708333333333332 | 0 |
| 0.8715277777777778 | 0 |
| 0.8722222222222222 | 0 |
| 0.8729166666666667 | 0 |
| 0.873611111111111 | 0 |
| 0.8743055555555556 | 0 |
| 0.875 | 0 |
| 0.8756944444444444 | 0 |
| 0.876388888888889 | 0 |
| 0.8770833333333333 | 0 |
| 0.8777777777777778 | 0 |
| 0.8784722222222222 | 0 |
| 0.8791666666666668 | 0 |
| 0.8798611111111111 | 0 |
| 0.8805555555555555 | 0 |
| 0.88125 | 0 |
| 0.8819444444444445 | 0 |
| 0.8826388888888889 | 0 |
| 0.8833333333333333 | 0 |
| 0.8840277777777777 | 0 |
| 0.8847222222222223 | 0 |
| 0.8854166666666666 | 0 |
| 0.8861111111111111 | 0 |
| 0.8868055555555556 | 0 |
| 0.8875000000000001 | 0 |
| 0.8881944444444444 | 0 |
| 0.8888888888888888 | 0 |
| 0.8895833333333334 | 0 |
| 0.8902777777777778 | 0 |
| 0.8909722222222222 | 0 |
| 0.8916666666666666 | 0 |
| 0.8923611111111112 | 0 |
| 0.8930555555555556 | 0 |
| 0.8937499999999999 | 0 |
| 0.8944444444444444 | 0 |
| 0.8951388888888889 | 0 |
| 0.8958333333333334 | 0 |
| 0.8965277777777777 | 0 |
| 0.8972222222222223 | 0 |
| 0.8979166666666667 | 0 |
| 0.8986111111111111 | 0 |
| 0.8993055555555555 | 0 |
| 0.9 | 0 |
| 0.9006944444444445 | 0 |
| 0.9013888888888889 | 0 |
| 0.9020833333333332 | 0 |
| 0.9027777777777778 | 0 |
| 0.9034722222222222 | 0 |
| 0.9041666666666667 | 0 |
| 0.904861111111111 | 0 |
| 0.9055555555555556 | 0 |
| 0.90625 | 0 |
| 0.9069444444444444 | 0 |
| 0.907638888888889 | 0 |
| 0.9083333333333333 | 0 |
| 0.9090277777777778 | 0 |
| 0.9097222222222222 | 0 |
| 0.9104166666666668 | 0 |
| 0.9111111111111111 | 0 |
| 0.9118055555555555 | 0 |
| 0.9125 | 0 |
| 0.9131944444444445 | 0 |
| 0.9138888888888889 | 0 |
| 0.9145833333333333 | 0 |
| 0.9152777777777777 | 0 |
| 0.9159722222222223 | 0 |
| 0.9166666666666666 | 0 |
| 0.9173611111111111 | 0 |
| 0.9180555555555556 | 0 |
| 0.9187500000000001 | 0 |
| 0.9194444444444444 | 0 |
| 0.9201388888888888 | 0 |
| 0.9208333333333334 | 0 |
| 0.9215277777777778 | 0 |
| 0.9222222222222222 | 0 |
| 0.9229166666666666 | 0 |
| 0.9236111111111112 | 0 |
| 0.9243055555555556 | 0 |
| 0.9249999999999999 | 0 |
| 0.9256944444444444 | 0 |
| 0.9263888888888889 | 0 |
| 0.9270833333333334 | 0 |
| 0.9277777777777777 | 0 |
| 0.9284722222222223 | 0 |
| 0.9291666666666667 | 0 |
| 0.9298611111111111 | 0 |
| 0.9305555555555555 | 0 |
| 0.93125 | 0 |
| 0.9319444444444445 | 0 |
| 0.9326388888888889 | 0 |
| 0.9333333333333332 | 0 |
| 0.9340277777777778 | 0 |
| 0.9347222222222222 | 0 |
| 0.9354166666666667 | 0 |
| 0.936111111111111 | 0 |
| 0.9368055555555556 | 0 |
| 0.9375 | 0 |
| 0.9381944444444444 | 0 |
| 0.938888888888889 | 0 |
| 0.9395833333333333 | 0 |
| 0.9402777777777778 | 0 |
| 0.9409722222222222 | 0 |
| 0.9416666666666668 | 0 |
| 0.9423611111111111 | 0 |
| 0.9430555555555555 | 0 |
| 0.94375 | 0 |
| 0.9444444444444445 | 0 |
| 0.9451388888888889 | 0 |
| 0.9458333333333333 | 0 |
| 0.9465277777777777 | 0 |
| 0.9472222222222223 | 0 |
| 0.9479166666666666 | 0 |
| 0.9486111111111111 | 0 |
| 0.9493055555555556 | 0 |
| 0.9500000000000001 | 0 |
| 0.9506944444444444 | 0 |
| 0.9513888888888888 | 0 |
| 0.9520833333333334 | 0 |
| 0.9527777777777778 | 0 |
| 0.9534722222222222 | 0 |
| 0.9541666666666666 | 0 |
| 0.9548611111111112 | 0 |
| 0.9555555555555556 | 0 |
| 0.9562499999999999 | 0 |
| 0.9569444444444444 | 0 |
| 0.9576388888888889 | 0 |
| 0.9583333333333334 | 0 |
| 0.9590277777777777 | 0 |
| 0.9597222222222223 | 0 |
| 0.9604166666666667 | 0 |
| 0.9611111111111111 | 0 |
| 0.9618055555555555 | 0 |
| 0.9625 | 0 |
| 0.9631944444444445 | 0 |
| 0.9638888888888889 | 0 |
| 0.9645833333333332 | 0 |
| 0.9652777777777778 | 0 |
| 0.9659722222222222 | 0 |
| 0.9666666666666667 | 0 |
| 0.967361111111111 | 0 |
| 0.9680555555555556 | 0 |
| 0.96875 | 0 |
| 0.9694444444444444 | 0 |
| 0.970138888888889 | 0 |
| 0.9708333333333333 | 0 |
| 0.9715277777777778 | 0 |
| 0.9722222222222222 | 0 |
| 0.9729166666666668 | 0 |
| 0.9736111111111111 | 0 |
| 0.9743055555555555 | 0 |
| 0.975 | 0 |
| 0.9756944444444445 | 0 |
| 0.9763888888888889 | 0 |
| 0.9770833333333333 | 0 |
| 0.9777777777777777 | 0 |
| 0.9784722222222223 | 0 |
| 0.9791666666666666 | 0 |
| 0.9798611111111111 | 0 |
| 0.9805555555555556 | 0 |
| 0.9812500000000001 | 0 |
| 0.9819444444444444 | 0 |
| 0.9826388888888888 | 0 |
| 0.9833333333333334 | 0 |
| 0.9840277777777778 | 0 |
| 0.9847222222222222 | 0 |
| 0.9854166666666666 | 0 |
| 0.9861111111111112 | 0 |
| 0.9868055555555556 | 0 |
| 0.9874999999999999 | 0 |
| 0.9881944444444444 | 0 |
| 0.9888888888888889 | 0 |
| 0.9895833333333334 | 0 |
| 0.9902777777777777 | 0 |
| 0.9909722222222223 | 0 |
| 0.9916666666666667 | 0 |
| 0.9923611111111111 | 0 |
| 0.9930555555555555 | 0 |
| 0.99375 | 0 |
| 0.9944444444444445 | 0 |
| 0.9951388888888889 | 0 |
| 0.9958333333333332 | 0 |
| 0.9965277777777778 | 0 |
| 0.9972222222222222 | 0 |
| 0.9979166666666667 | 0 |
| 0.998611111111111 | 0 |
| 0.9993055555555556 | 0 |